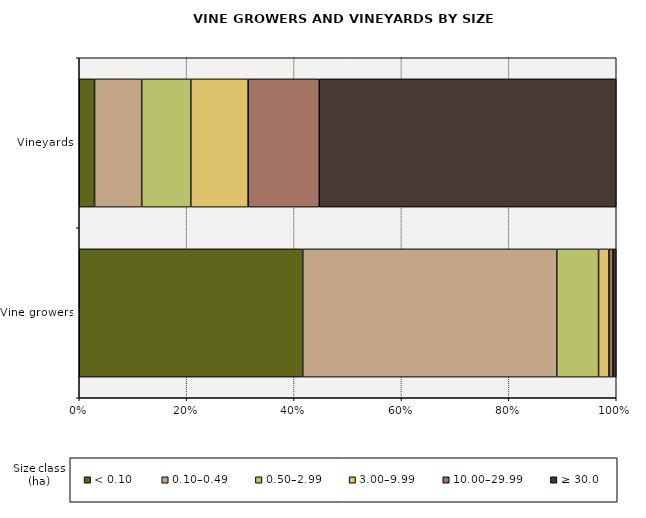
| Category | < 0.10 | 0.10–0.49 | 0.50–2.99 | 3.00–9.99 | 10.00–29.99 | ≥ 30.0 |
|---|---|---|---|---|---|---|
| Vine growers | 7581 | 8617 | 1418 | 353 | 140 | 107 |
| Vineyards | 504.782 | 1552.186 | 1617.335 | 1889.059 | 2343.44 | 9781.788 |